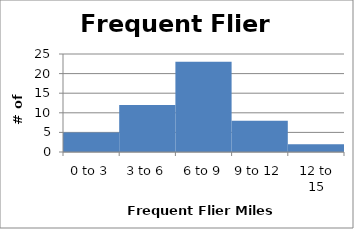
| Category | Frequent Flyer Miles |
|---|---|
| 0 to 3 | 5 |
| 3 to 6 | 12 |
| 6 to 9 | 23 |
| 9 to 12 | 8 |
| 12 to 15 | 2 |